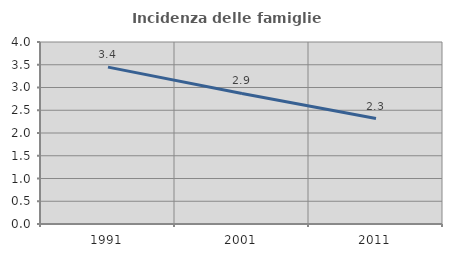
| Category | Incidenza delle famiglie numerose |
|---|---|
| 1991.0 | 3.448 |
| 2001.0 | 2.869 |
| 2011.0 | 2.318 |